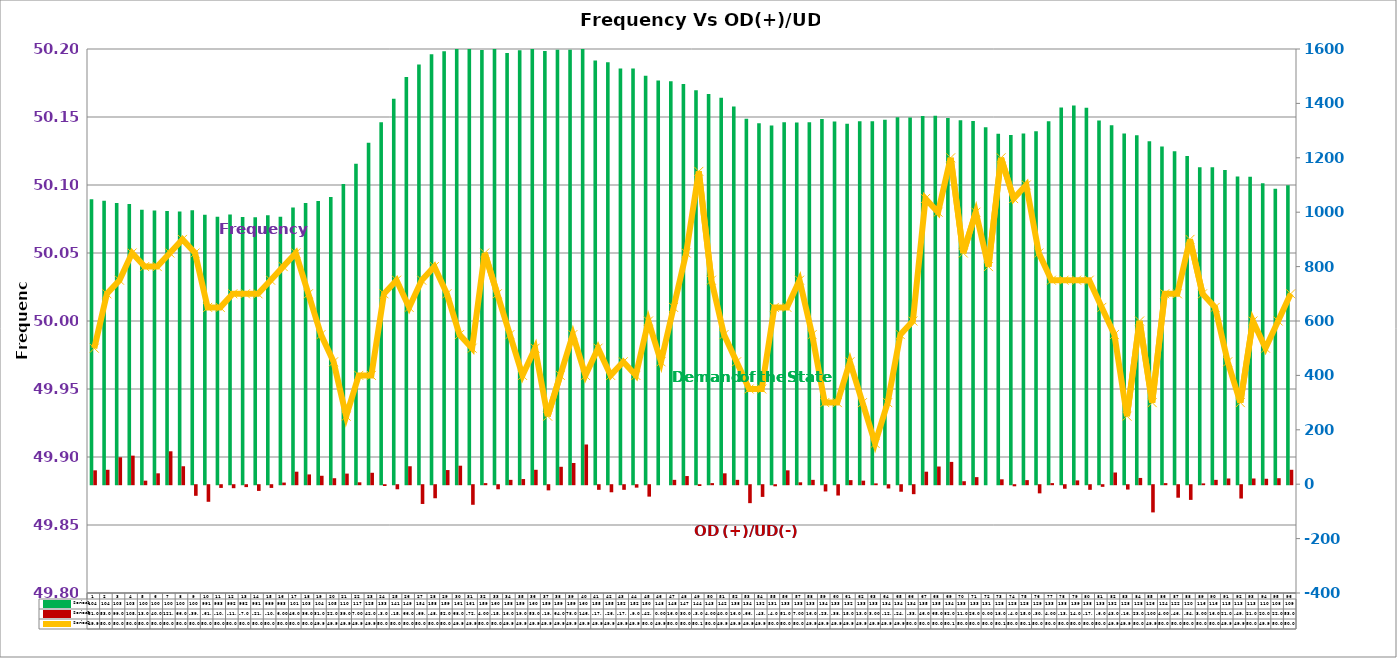
| Category | Series 2 | Series 4 |
|---|---|---|
| 0 | 1048 | 51 |
| 1 | 1042 | 53 |
| 2 | 1034 | 99 |
| 3 | 1030 | 105 |
| 4 | 1009 | 13 |
| 5 | 1006 | 40 |
| 6 | 1004 | 121 |
| 7 | 1003 | 66 |
| 8 | 1007 | -39 |
| 9 | 991 | -61 |
| 10 | 983 | -10 |
| 11 | 992 | -11 |
| 12 | 982 | -7 |
| 13 | 981 | -21 |
| 14 | 989 | -10 |
| 15 | 983 | 6 |
| 16 | 1017 | 46 |
| 17 | 1034 | 36 |
| 18 | 1041 | 31 |
| 19 | 1056 | 22 |
| 20 | 1104 | 39 |
| 21 | 1178 | 7 |
| 22 | 1255 | 42 |
| 23 | 1331 | -3 |
| 24 | 1417 | -15 |
| 25 | 1497 | 66 |
| 26 | 1543 | -69 |
| 27 | 1581 | -48 |
| 28 | 1592 | 52 |
| 29 | 1617 | 68 |
| 30 | 1611 | -72 |
| 31 | 1596 | 4 |
| 32 | 1603 | -15 |
| 33 | 1585 | 16 |
| 34 | 1595 | 19 |
| 35 | 1606 | 53 |
| 36 | 1593 | -19 |
| 37 | 1597 | 64 |
| 38 | 1597 | 78 |
| 39 | 1609 | 146 |
| 40 | 1558 | -17 |
| 41 | 1551 | -26 |
| 42 | 1528 | -17 |
| 43 | 1528 | -9 |
| 44 | 1502 | -42 |
| 45 | 1484 | 0 |
| 46 | 1481 | 16 |
| 47 | 1471 | 30 |
| 48 | 1448 | -3 |
| 49 | 1435 | 4 |
| 50 | 1421 | 40 |
| 51 | 1389 | 16 |
| 52 | 1344 | -66 |
| 53 | 1327 | -43 |
| 54 | 1319 | -4 |
| 55 | 1331 | 51 |
| 56 | 1330 | 7 |
| 57 | 1331 | 16 |
| 58 | 1343 | -23 |
| 59 | 1333 | -38 |
| 60 | 1325 | 15 |
| 61 | 1334 | 13 |
| 62 | 1334 | 3 |
| 63 | 1340 | -12 |
| 64 | 1349 | -24 |
| 65 | 1348 | -33 |
| 66 | 1354 | 46 |
| 67 | 1355 | 65 |
| 68 | 1346 | 82 |
| 69 | 1338 | 11 |
| 70 | 1335 | 26 |
| 71 | 1312 | 0 |
| 72 | 1288 | 18 |
| 73 | 1284 | -4 |
| 74 | 1289 | 15 |
| 75 | 1298 | -30 |
| 76 | 1334 | 4 |
| 77 | 1385 | -13 |
| 78 | 1392 | 14 |
| 79 | 1384 | -17 |
| 80 | 1337 | -6 |
| 81 | 1320 | 43 |
| 82 | 1289 | -16 |
| 83 | 1283 | 23 |
| 84 | 1261 | -100 |
| 85 | 1242 | 4 |
| 86 | 1224 | -46 |
| 87 | 1207 | -54 |
| 88 | 1165 | 3 |
| 89 | 1165 | 16 |
| 90 | 1155 | 21 |
| 91 | 1131 | -49 |
| 92 | 1130 | 21 |
| 93 | 1106 | 20 |
| 94 | 1086 | 22 |
| 95 | 1099 | 53 |